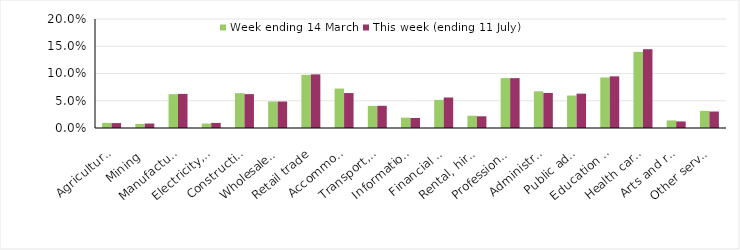
| Category | Week ending 14 March | This week (ending 11 July) |
|---|---|---|
| Agriculture, forestry and fishing | 0.009 | 0.009 |
| Mining | 0.008 | 0.008 |
| Manufacturing | 0.062 | 0.063 |
| Electricity, gas, water and waste services | 0.008 | 0.009 |
| Construction | 0.064 | 0.062 |
| Wholesale trade | 0.049 | 0.049 |
| Retail trade | 0.097 | 0.098 |
| Accommodation and food services | 0.072 | 0.064 |
| Transport, postal and warehousing | 0.041 | 0.041 |
| Information media and telecommunications | 0.019 | 0.018 |
| Financial and insurance services | 0.052 | 0.056 |
| Rental, hiring and real estate services | 0.022 | 0.022 |
| Professional, scientific and technical services | 0.092 | 0.092 |
| Administrative and support services | 0.067 | 0.064 |
| Public administration and safety | 0.06 | 0.063 |
| Education and training | 0.093 | 0.095 |
| Health care and social assistance | 0.14 | 0.145 |
| Arts and recreation services | 0.014 | 0.012 |
| Other services | 0.031 | 0.03 |